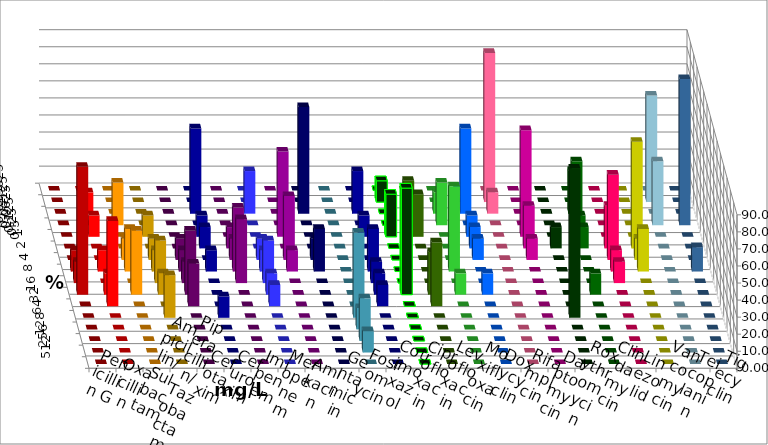
| Category | Penicillin G | Oxacillin | Ampicillin/ Sulbactam | Piperacillin/ Tazobactam | Cefotaxim | Cefuroxim | Imipenem | Meropenem | Amikacin | Gentamicin | Fosfomycin | Cotrimoxazol | Ciprofloxacin | Levofloxacin | Moxifloxacin | Doxycyclin | Rifampicin | Daptomycin | Roxythromycin | Clindamycin | Linezolid | Vancomycin | Teicoplanin | Tigecyclin |
|---|---|---|---|---|---|---|---|---|---|---|---|---|---|---|---|---|---|---|---|---|---|---|---|---|
| 0.015625 | 0 | 0 | 0 | 0 | 0 | 0 | 0 | 0 | 0 | 0 | 0 | 0 | 0 | 0 | 0 | 0 | 0 | 0 | 0 | 0 | 0 | 0 | 0 | 0 |
| 0.03125 | 0 | 0 | 0 | 0 | 0 | 0 | 0 | 0 | 0 | 0 | 0 | 0 | 12.5 | 12.5 | 0 | 0 | 87.5 | 0 | 0 | 0 | 0 | 0 | 0 | 62.5 |
| 0.0625 | 0 | 12.5 | 0 | 0 | 0 | 0 | 50 | 25 | 0 | 62.5 | 0 | 25 | 0 | 0 | 12.5 | 50 | 12.5 | 0 | 0 | 25 | 0 | 0 | 0 | 0 |
| 0.125 | 0 | 0 | 25 | 0 | 0 | 0 | 0 | 0 | 0 | 0 | 0 | 0 | 0 | 0 | 25 | 0 | 0 | 0 | 0 | 37.5 | 0 | 0 | 85.714 | 37.5 |
| 0.25 | 0 | 12.5 | 0 | 12.5 | 0 | 0 | 12.5 | 0 | 50 | 0 | 0 | 12.5 | 25 | 25 | 0 | 12.5 | 0 | 62.5 | 0 | 12.5 | 0 | 0 | 0 | 0 |
| 0.5 | 0 | 0 | 0 | 0 | 0 | 12.5 | 12.5 | 0 | 0 | 0 | 0 | 0 | 0 | 0 | 0 | 12.5 | 0 | 25 | 12.5 | 12.5 | 25 | 62.5 | 0 | 0 |
| 1.0 | 0 | 0 | 12.5 | 12.5 | 12.5 | 12.5 | 0 | 12.5 | 37.5 | 12.5 | 0 | 0 | 0 | 0 | 0 | 12.5 | 0 | 12.5 | 0 | 0 | 50 | 12.5 | 0 | 0 |
| 2.0 | 12.5 | 12.5 | 25 | 12.5 | 12.5 | 37.5 | 12.5 | 12.5 | 12.5 | 25 | 0 | 25 | 0 | 0 | 50 | 0 | 0 | 0 | 0 | 0 | 12.5 | 25 | 14.286 | 0 |
| 4.0 | 12.5 | 0 | 0 | 25 | 12.5 | 37.5 | 0 | 25 | 0 | 0 | 0 | 12.5 | 0 | 0 | 0 | 0 | 0 | 0 | 0 | 0 | 12.5 | 0 | 0 | 0 |
| 8.0 | 75 | 12.5 | 37.5 | 12.5 | 37.5 | 0 | 0 | 12.5 | 0 | 0 | 0 | 12.5 | 62.5 | 25 | 12.5 | 12.5 | 0 | 0 | 0 | 12.5 | 0 | 0 | 0 | 0 |
| 16.0 | 0 | 50 | 0 | 0 | 25 | 0 | 0 | 12.5 | 0 | 0 | 0 | 12.5 | 0 | 37.5 | 0 | 0 | 0 | 0 | 0 | 0 | 0 | 0 | 0 | 0 |
| 32.0 | 0 | 0 | 0 | 25 | 0 | 0 | 12.5 | 0 | 0 | 0 | 50 | 0 | 0 | 0 | 0 | 0 | 0 | 0 | 87.5 | 0 | 0 | 0 | 0 | 0 |
| 64.0 | 0 | 0 | 0 | 0 | 0 | 0 | 0 | 0 | 0 | 0 | 12.5 | 0 | 0 | 0 | 0 | 0 | 0 | 0 | 0 | 0 | 0 | 0 | 0 | 0 |
| 128.0 | 0 | 0 | 0 | 0 | 0 | 0 | 0 | 0 | 0 | 0 | 25 | 0 | 0 | 0 | 0 | 0 | 0 | 0 | 0 | 0 | 0 | 0 | 0 | 0 |
| 256.0 | 0 | 0 | 0 | 0 | 0 | 0 | 0 | 0 | 0 | 0 | 12.5 | 0 | 0 | 0 | 0 | 0 | 0 | 0 | 0 | 0 | 0 | 0 | 0 | 0 |
| 512.0 | 0 | 0 | 0 | 0 | 0 | 0 | 0 | 0 | 0 | 0 | 0 | 0 | 0 | 0 | 0 | 0 | 0 | 0 | 0 | 0 | 0 | 0 | 0 | 0 |